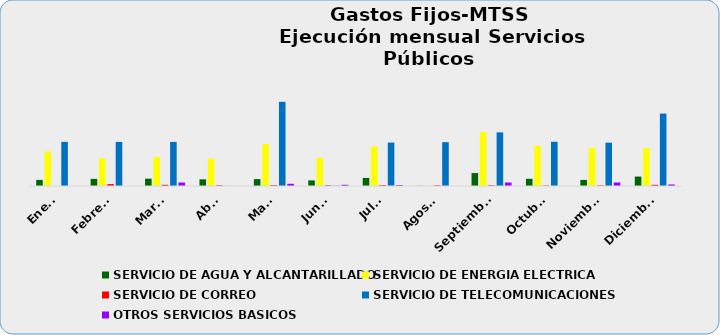
| Category | SERVICIO DE AGUA Y ALCANTARILLADO | SERVICIO DE ENERGIA ELECTRICA | SERVICIO DE CORREO | SERVICIO DE TELECOMUNICACIONES | OTROS SERVICIOS BASICOS |
|---|---|---|---|---|---|
| Enero | 1803712.1 | 10119293.3 | 0 | 12984731.9 | 0 |
| Febrero | 2085413.5 | 8112379.94 | 550260 | 12970890.06 | 0 |
| Marzo | 2150114 | 8493292.13 | 350020 | 12969029.45 | 1023305.35 |
| Abril | 1960976.89 | 8033945.1 | 245230 | 25999.48 | 0 |
| Mayo | 2026159.2 | 12373148 | 268755 | 24757459.95 | 658201 |
| Junio | 1644296.5 | 8273058.37 | 227220 | 91498.17 | 365104.35 |
| Julio | 2377395 | 11611775.21 | 263455 | 12772913.02 | 284656.77 |
| Agosto | 43703.4 | 62526.22 | 202595 | 12895144.05 | 0 |
| Septiembre | 3803313 | 15832274.25 | 217425 | 15771713.15 | 1025080.5 |
| Octubre | 2117085.2 | 11845515.88 | 138140 | 13015113.6 | 0 |
| Noviembre | 1791348 | 11255390.37 | 195030 | 12742302.94 | 1032215.56 |
| Diciembre | 2774912 | 11144071.28 | 351335 | 21300772.27 | 454195 |